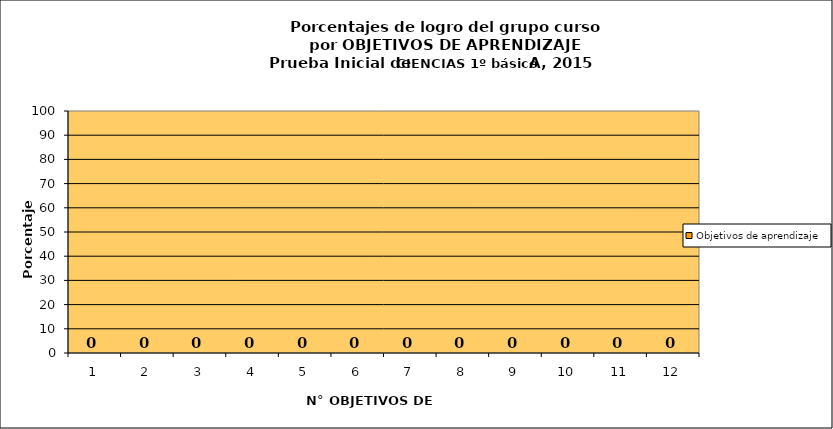
| Category | Objetivos de aprendizaje |
|---|---|
| 0 | 0 |
| 1 | 0 |
| 2 | 0 |
| 3 | 0 |
| 4 | 0 |
| 5 | 0 |
| 6 | 0 |
| 7 | 0 |
| 8 | 0 |
| 9 | 0 |
| 10 | 0 |
| 11 | 0 |